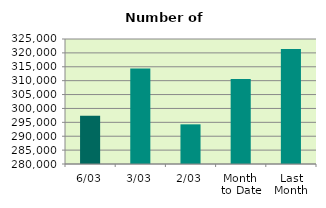
| Category | Series 0 |
|---|---|
| 6/03 | 297364 |
| 3/03 | 314346 |
| 2/03 | 294278 |
| Month 
to Date | 310586 |
| Last
Month | 321374.6 |